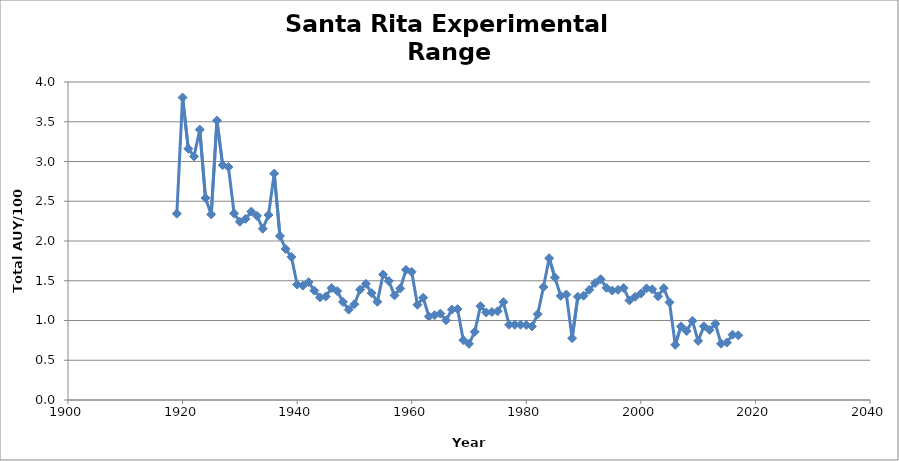
| Category | Series 0 |
|---|---|
| 1919.0 | 2.344 |
| 1920.0 | 3.805 |
| 1921.0 | 3.16 |
| 1922.0 | 3.064 |
| 1923.0 | 3.402 |
| 1924.0 | 2.541 |
| 1925.0 | 2.335 |
| 1926.0 | 3.514 |
| 1927.0 | 2.954 |
| 1928.0 | 2.932 |
| 1929.0 | 2.347 |
| 1930.0 | 2.242 |
| 1931.0 | 2.279 |
| 1932.0 | 2.37 |
| 1933.0 | 2.316 |
| 1934.0 | 2.154 |
| 1935.0 | 2.327 |
| 1936.0 | 2.848 |
| 1937.0 | 2.063 |
| 1938.0 | 1.899 |
| 1939.0 | 1.8 |
| 1940.0 | 1.452 |
| 1941.0 | 1.439 |
| 1942.0 | 1.482 |
| 1943.0 | 1.376 |
| 1944.0 | 1.291 |
| 1945.0 | 1.302 |
| 1946.0 | 1.407 |
| 1947.0 | 1.37 |
| 1948.0 | 1.233 |
| 1949.0 | 1.136 |
| 1950.0 | 1.204 |
| 1951.0 | 1.389 |
| 1952.0 | 1.462 |
| 1953.0 | 1.344 |
| 1954.0 | 1.235 |
| 1955.0 | 1.579 |
| 1956.0 | 1.497 |
| 1957.0 | 1.316 |
| 1958.0 | 1.403 |
| 1959.0 | 1.637 |
| 1960.0 | 1.611 |
| 1961.0 | 1.199 |
| 1962.0 | 1.286 |
| 1963.0 | 1.05 |
| 1964.0 | 1.067 |
| 1965.0 | 1.087 |
| 1966.0 | 1.003 |
| 1967.0 | 1.138 |
| 1968.0 | 1.144 |
| 1969.0 | 0.753 |
| 1970.0 | 0.707 |
| 1971.0 | 0.857 |
| 1972.0 | 1.181 |
| 1973.0 | 1.101 |
| 1974.0 | 1.107 |
| 1975.0 | 1.116 |
| 1976.0 | 1.231 |
| 1977.0 | 0.947 |
| 1978.0 | 0.947 |
| 1979.0 | 0.947 |
| 1980.0 | 0.943 |
| 1981.0 | 0.926 |
| 1982.0 | 1.08 |
| 1983.0 | 1.421 |
| 1984.0 | 1.783 |
| 1985.0 | 1.54 |
| 1986.0 | 1.309 |
| 1987.0 | 1.327 |
| 1988.0 | 0.778 |
| 1989.0 | 1.299 |
| 1990.0 | 1.312 |
| 1991.0 | 1.386 |
| 1992.0 | 1.471 |
| 1993.0 | 1.519 |
| 1994.0 | 1.411 |
| 1995.0 | 1.377 |
| 1996.0 | 1.385 |
| 1997.0 | 1.408 |
| 1998.0 | 1.253 |
| 1999.0 | 1.298 |
| 2000.0 | 1.338 |
| 2001.0 | 1.404 |
| 2002.0 | 1.392 |
| 2003.0 | 1.304 |
| 2004.0 | 1.406 |
| 2005.0 | 1.229 |
| 2006.0 | 0.694 |
| 2007.0 | 0.926 |
| 2008.0 | 0.868 |
| 2009.0 | 0.996 |
| 2010.0 | 0.744 |
| 2011.0 | 0.927 |
| 2012.0 | 0.882 |
| 2013.0 | 0.958 |
| 2014.0 | 0.708 |
| 2015.0 | 0.723 |
| 2016.0 | 0.821 |
| 2017.0 | 0.814 |